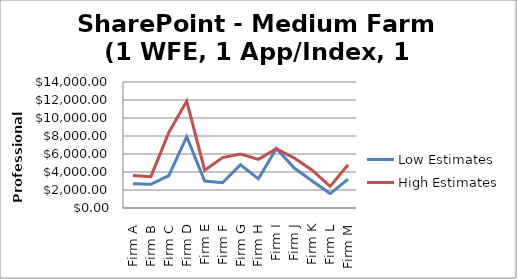
| Category | Low Estimates | High Estimates |
|---|---|---|
| Firm A | 2700 | 3600 |
| Firm B | 2640 | 3480 |
| Firm C | 3600 | 8400 |
| Firm D | 7920 | 11880 |
| Firm E | 3000 | 4200 |
| Firm F | 2800 | 5600 |
| Firm G | 4800 | 6000 |
| Firm H | 3240 | 5400 |
| Firm I | 6600 | 6600 |
| Firm J | 4440 | 5550 |
| Firm K | 3000 | 4200 |
| Firm L | 1600 | 2400 |
| Firm M | 3200 | 4800 |